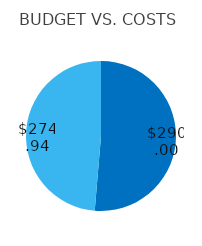
| Category | Series 0 |
|---|---|
| 0 | 290 |
| 1 | 274.94 |